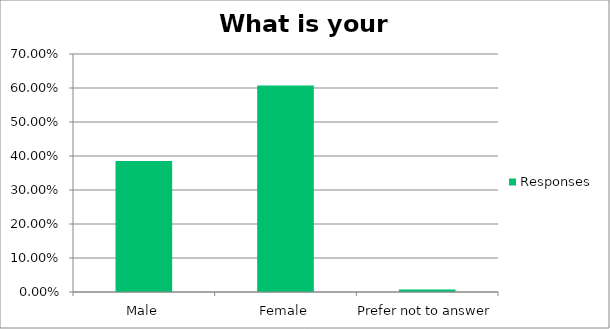
| Category | Responses |
|---|---|
| Male | 0.386 |
| Female | 0.607 |
| Prefer not to answer | 0.007 |